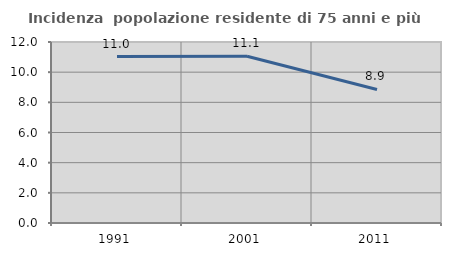
| Category | Incidenza  popolazione residente di 75 anni e più |
|---|---|
| 1991.0 | 11.031 |
| 2001.0 | 11.058 |
| 2011.0 | 8.855 |